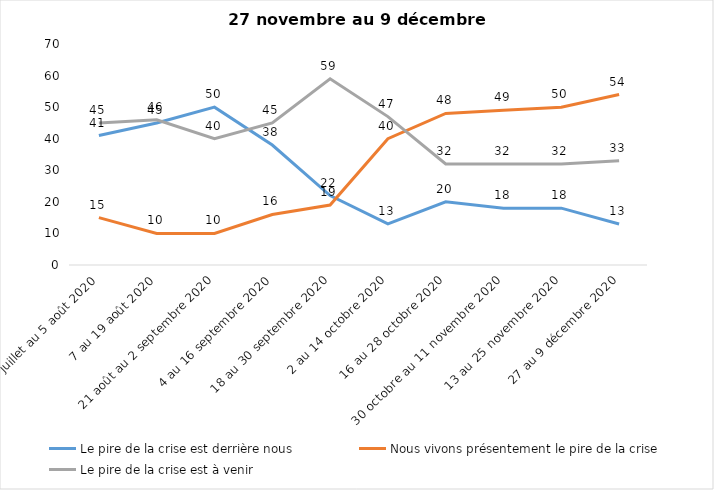
| Category | Le pire de la crise est derrière nous | Nous vivons présentement le pire de la crise | Le pire de la crise est à venir |
|---|---|---|---|
| 24 juillet au 5 août 2020 | 41 | 15 | 45 |
| 7 au 19 août 2020 | 45 | 10 | 46 |
| 21 août au 2 septembre 2020 | 50 | 10 | 40 |
| 4 au 16 septembre 2020 | 38 | 16 | 45 |
| 18 au 30 septembre 2020 | 22 | 19 | 59 |
| 2 au 14 octobre 2020 | 13 | 40 | 47 |
| 16 au 28 octobre 2020 | 20 | 48 | 32 |
| 30 octobre au 11 novembre 2020 | 18 | 49 | 32 |
| 13 au 25 novembre 2020 | 18 | 50 | 32 |
| 27 au 9 décembre 2020 | 13 | 54 | 33 |